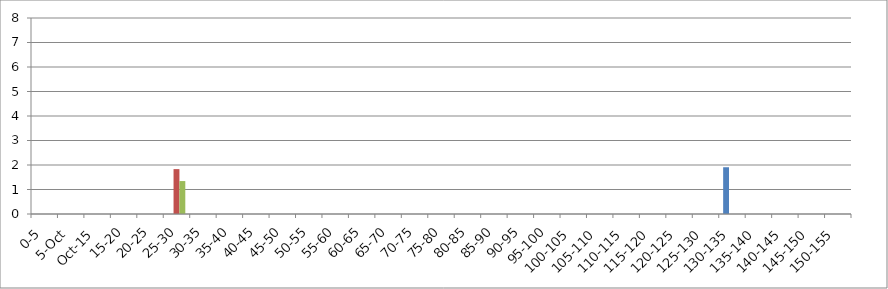
| Category | UNION_ALL | INTERSECTION_ALL | UNION(INTERSECTION_119875_146067,INTERSECTION_119875_241240,INTERSECTION_146067_241240) |
|---|---|---|---|
| 0-5 | 0 | 0 | 0 |
| 5-Oct | 0 | 0 | 0 |
| Oct-15 | 0 | 0 | 0 |
| 15-20 | 0 | 0 | 0 |
| 20-25 | 0 | 0 | 0 |
| 25-30 | 0 | 1.832 | 1.344 |
| 30-35 | 0 | 0 | 0 |
| 35-40 | 0 | 0 | 0 |
| 40-45 | 0 | 0 | 0 |
| 45-50 | 0 | 0 | 0 |
| 50-55 | 0 | 0 | 0 |
| 55-60 | 0 | 0 | 0 |
| 60-65 | 0 | 0 | 0 |
| 65-70 | 0 | 0 | 0 |
| 70-75 | 0 | 0 | 0 |
| 75-80 | 0 | 0 | 0 |
| 80-85 | 0 | 0 | 0 |
| 85-90 | 0 | 0 | 0 |
| 90-95 | 0 | 0 | 0 |
| 95-100 | 0 | 0 | 0 |
| 100-105 | 0 | 0 | 0 |
| 105-110 | 0 | 0 | 0 |
| 110-115 | 0 | 0 | 0 |
| 115-120 | 0 | 0 | 0 |
| 120-125 | 0 | 0 | 0 |
| 125-130 | 0 | 0 | 0 |
| 130-135 | 1.908 | 0 | 0 |
| 135-140 | 0 | 0 | 0 |
| 140-145 | 0 | 0 | 0 |
| 145-150 | 0 | 0 | 0 |
| 150-155 | 0 | 0 | 0 |